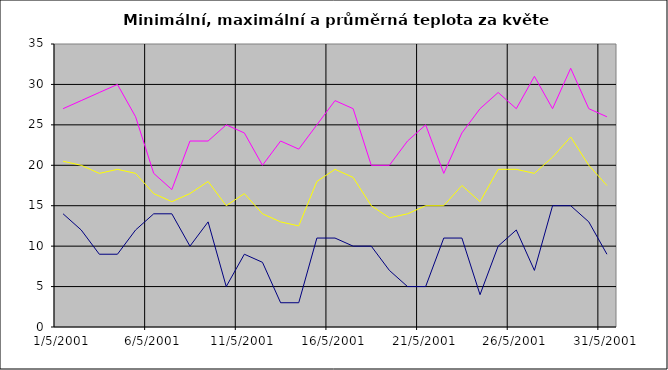
| Category | Series 0 | Series 1 | Series 2 |
|---|---|---|---|
| 2001-05-01 | 14 | 27 | 20.5 |
| 2001-05-02 | 12 | 28 | 20 |
| 2001-05-03 | 9 | 29 | 19 |
| 2001-05-04 | 9 | 30 | 19.5 |
| 2001-05-05 | 12 | 26 | 19 |
| 2001-05-06 | 14 | 19 | 16.5 |
| 2001-05-07 | 14 | 17 | 15.5 |
| 2001-05-08 | 10 | 23 | 16.5 |
| 2001-05-09 | 13 | 23 | 18 |
| 2001-05-10 | 5 | 25 | 15 |
| 2001-05-11 | 9 | 24 | 16.5 |
| 2001-05-12 | 8 | 20 | 14 |
| 2001-05-13 | 3 | 23 | 13 |
| 2001-05-14 | 3 | 22 | 12.5 |
| 2001-05-15 | 11 | 25 | 18 |
| 2001-05-16 | 11 | 28 | 19.5 |
| 2001-05-17 | 10 | 27 | 18.5 |
| 2001-05-18 | 10 | 20 | 15 |
| 2001-05-19 | 7 | 20 | 13.5 |
| 2001-05-20 | 5 | 23 | 14 |
| 2001-05-21 | 5 | 25 | 15 |
| 2001-05-22 | 11 | 19 | 15 |
| 2001-05-23 | 11 | 24 | 17.5 |
| 2001-05-24 | 4 | 27 | 15.5 |
| 2001-05-25 | 10 | 29 | 19.5 |
| 2001-05-26 | 12 | 27 | 19.5 |
| 2001-05-27 | 7 | 31 | 19 |
| 2001-05-28 | 15 | 27 | 21 |
| 2001-05-29 | 15 | 32 | 23.5 |
| 2001-05-30 | 13 | 27 | 20 |
| 2001-05-31 | 9 | 26 | 17.5 |